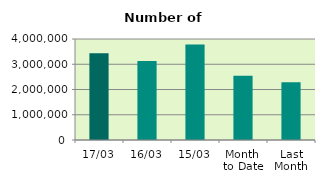
| Category | Series 0 |
|---|---|
| 17/03 | 3438340 |
| 16/03 | 3131568 |
| 15/03 | 3778340 |
| Month 
to Date | 2549347.692 |
| Last
Month | 2290810.7 |